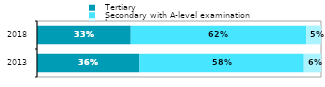
| Category |   Tertiary |   Secondary with A-level examination |   Lower |
|---|---|---|---|
| 2013.0 | 0.361 | 0.579 | 0.061 |
| 2018.0 | 0.33 | 0.618 | 0.052 |